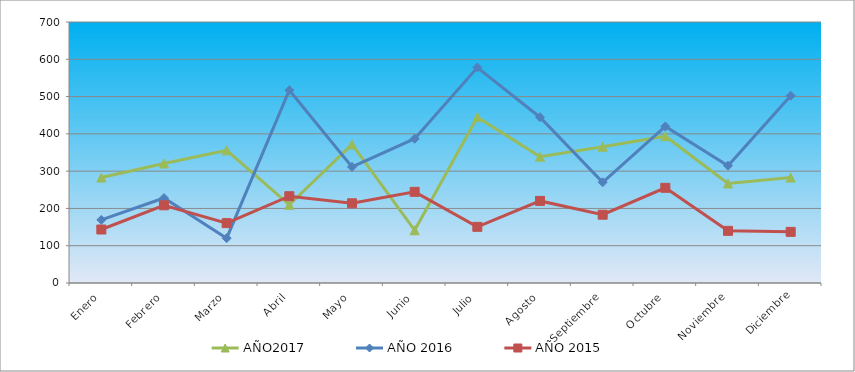
| Category | AÑO2017 | AÑO 2016 | AÑO 2015 |
|---|---|---|---|
| Enero | 282.789 | 169.265 | 143.451 |
| Febrero | 320.575 | 227.893 | 208.409 |
| Marzo | 355.924 | 120.219 | 160.592 |
| Abril | 209.654 | 517.106 | 232.769 |
| Mayo | 371.77 | 311.252 | 213.823 |
| Junio | 141.394 | 387.006 | 244.497 |
| Julio | 444.905 | 578.039 | 150.668 |
| Agosto | 338.859 | 444.645 | 220.138 |
| Septiembre | 365.675 | 270.081 | 183.148 |
| Octubre | 393.71 | 419.943 | 255.324 |
| Noviembre | 266.943 | 314.545 | 139.842 |
| Diciembre | 282.789 | 502.285 | 137.135 |